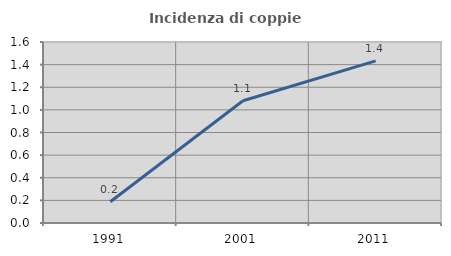
| Category | Incidenza di coppie miste |
|---|---|
| 1991.0 | 0.188 |
| 2001.0 | 1.081 |
| 2011.0 | 1.434 |